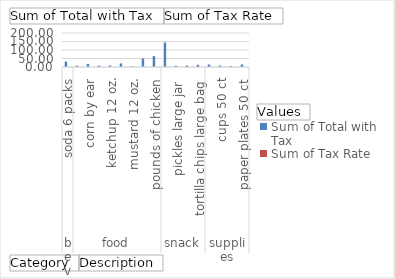
| Category | Sum of Total with Tax | Sum of Tax Rate |
|---|---|---|
| 0 | 32.04 | 0.07 |
| 1 | 7.96 | 0 |
| 2 | 18 | 0 |
| 3 | 7.98 | 0 |
| 4 | 8.97 | 0 |
| 5 | 20.97 | 0 |
| 6 | 3.98 | 0 |
| 7 | 49.9 | 0 |
| 8 | 63.84 | 0 |
| 9 | 143.97 | 0.07 |
| 10 | 7.48 | 0.07 |
| 11 | 8.54 | 0.07 |
| 12 | 12.82 | 0.07 |
| 13 | 14.96 | 0.07 |
| 14 | 8.54 | 0.07 |
| 15 | 5.54 | 0.07 |
| 16 | 14.96 | 0.07 |